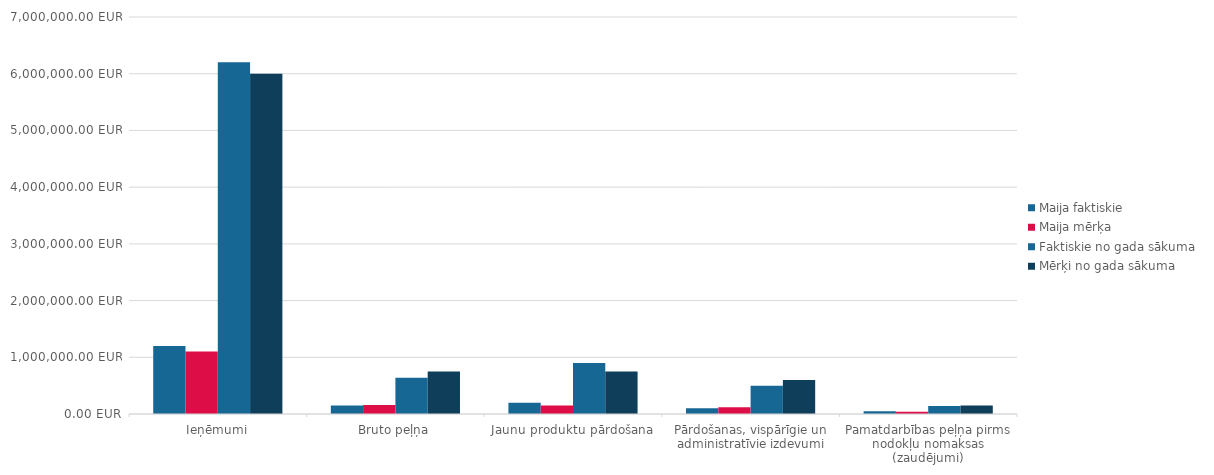
| Category | Maija faktiskie | Maija mērķa | Faktiskie no gada sākuma | Mērķi no gada sākuma |
|---|---|---|---|---|
| Ieņēmumi | 1200000 | 1100000 | 6200000 | 6000000 |
| Bruto peļņa | 150000 | 160000 | 640000 | 750000 |
| Jaunu produktu pārdošana | 200000 | 150000 | 900000 | 750000 |
| Pārdošanas, vispārīgie un administratīvie izdevumi | 100000 | 120000 | 500000 | 600000 |
| Pamatdarbības peļņa pirms nodokļu nomaksas (zaudējumi) | 50000 | 40000 | 140000 | 150000 |